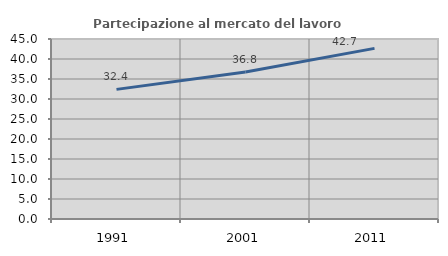
| Category | Partecipazione al mercato del lavoro  femminile |
|---|---|
| 1991.0 | 32.403 |
| 2001.0 | 36.768 |
| 2011.0 | 42.661 |